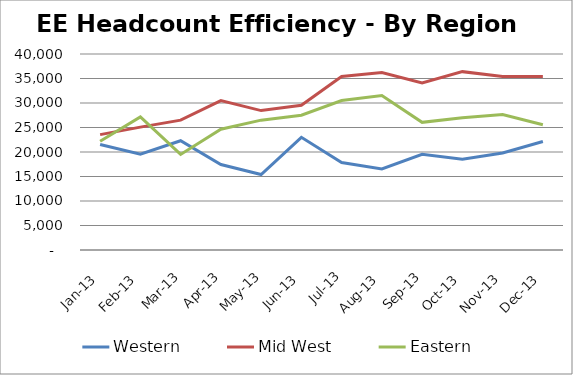
| Category | Western | Mid West | Eastern |
|---|---|---|---|
| 2013-01-31 | 21544 | 23541 | 22194 |
| 2013-02-28 | 19542 | 25080 | 27154 |
| 2013-03-31 | 22300 | 26500 | 19500 |
| 2013-04-30 | 17450 | 30500 | 24657 |
| 2013-05-31 | 15412 | 28450 | 26500 |
| 2013-06-30 | 23000 | 29540 | 27500 |
| 2013-07-31 | 17840 | 35412 | 30500 |
| 2013-08-31 | 16544 | 36214 | 31540 |
| 2013-09-30 | 19540 | 34102 | 26050 |
| 2013-10-31 | 18540 | 36400 | 27000 |
| 2013-11-30 | 19800 | 35400 | 27645 |
| 2013-12-31 | 22150 | 35410 | 25550 |